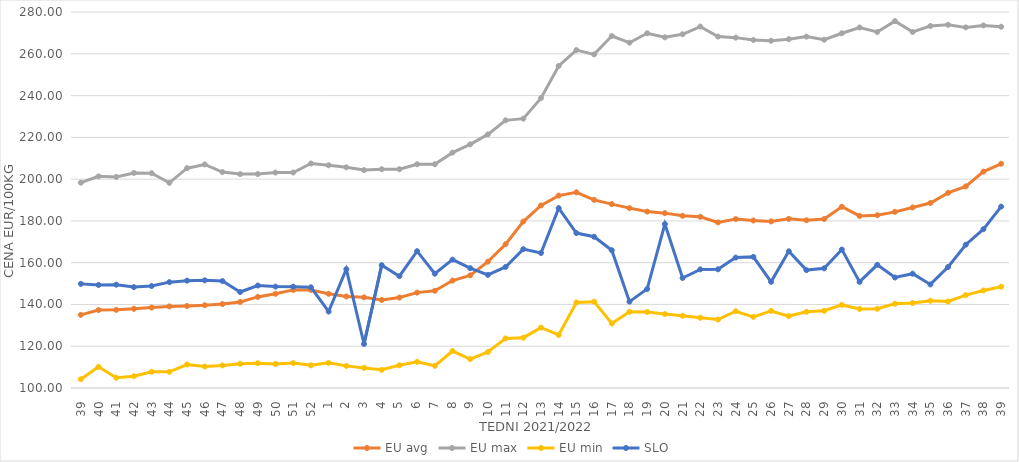
| Category | EU avg | EU max | EU min | SLO |
|---|---|---|---|---|
| 39.0 | 135.021 | 198.3 | 104.21 | 149.86 |
| 40.0 | 137.315 | 201.34 | 110.15 | 149.34 |
| 41.0 | 137.411 | 201.081 | 104.9 | 149.48 |
| 42.0 | 137.908 | 202.98 | 105.65 | 148.32 |
| 43.0 | 138.52 | 202.856 | 107.8 | 148.83 |
| 44.0 | 139.076 | 198.26 | 107.75 | 150.69 |
| 45.0 | 139.275 | 205.257 | 111.25 | 151.41 |
| 46.0 | 139.626 | 207.046 | 110.26 | 151.56 |
| 47.0 | 140.17 | 203.387 | 110.83 | 151.2 |
| 48.0 | 141.2 | 202.42 | 111.62 | 145.97 |
| 49.0 | 143.614 | 202.45 | 111.89 | 149.07 |
| 50.0 | 145.101 | 203.17 | 111.54 | 148.55 |
| 51.0 | 146.984 | 203.17 | 111.93 | 148.54 |
| 52.0 | 146.958 | 207.5 | 110.85 | 148.22 |
| 1.0 | 145.11 | 206.66 | 112.04 | 136.59 |
| 2.0 | 143.822 | 205.67 | 110.59 | 156.88 |
| 3.0 | 143.402 | 204.34 | 109.62 | 121.07 |
| 4.0 | 142.134 | 204.76 | 108.71 | 158.82 |
| 5.0 | 143.314 | 204.76 | 110.86 | 153.55 |
| 6.0 | 145.677 | 207.14 | 112.52 | 165.51 |
| 7.0 | 146.556 | 207.14 | 110.619 | 154.74 |
| 8.0 | 151.439 | 212.7 | 117.709 | 161.48 |
| 9.0 | 153.947 | 216.67 | 113.871 | 157.38 |
| 10.0 | 160.496 | 221.43 | 117.233 | 154.16 |
| 11.0 | 168.845 | 228.17 | 123.737 | 157.96 |
| 12.0 | 179.714 | 228.97 | 124.105 | 166.49 |
| 13.0 | 187.409 | 238.81 | 128.918 | 164.66 |
| 14.0 | 192.137 | 254.21 | 125.399 | 186.11 |
| 15.0 | 193.697 | 261.79 | 140.954 | 174.18 |
| 16.0 | 190.066 | 259.76 | 141.337 | 172.42 |
| 17.0 | 188.031 | 268.52 | 130.897 | 165.96 |
| 18.0 | 186.119 | 265.34 | 136.529 | 141.36 |
| 19.0 | 184.47 | 269.87 | 136.387 | 147.43 |
| 20.0 | 183.734 | 267.92 | 135.392 | 178.51 |
| 21.0 | 182.45 | 269.38 | 134.589 | 152.67 |
| 22.0 | 181.991 | 273.06 | 133.621 | 156.8 |
| 23.0 | 179.308 | 268.27 | 132.787 | 156.84 |
| 24.0 | 180.886 | 267.77 | 136.75 | 162.44 |
| 25.0 | 180.2 | 266.63 | 134.058 | 162.78 |
| 26.0 | 179.77 | 266.27 | 136.895 | 150.82 |
| 27.0 | 180.992 | 267.02 | 134.44 | 165.45 |
| 28.0 | 180.305 | 268.25 | 136.486 | 156.46 |
| 29.0 | 180.913 | 266.77 | 136.97 | 157.31 |
| 30.0 | 186.794 | 269.87 | 139.777 | 166.29 |
| 31.0 | 182.385 | 272.64 | 137.828 | 150.81 |
| 32.0 | 182.73 | 270.47 | 137.934 | 158.99 |
| 33.0 | 184.343 | 275.68 | 140.33 | 152.91 |
| 34.0 | 186.448 | 270.49 | 140.7 | 154.73 |
| 35.0 | 188.567 | 273.33 | 141.78 | 149.6 |
| 36.0 | 193.455 | 273.91 | 141.41 | 157.93 |
| 37.0 | 196.521 | 272.67 | 144.47 | 168.61 |
| 38.0 | 203.617 | 273.63 | 146.68 | 176.07 |
| 39.0 | 207.359 | 272.98 | 148.499 | 186.86 |